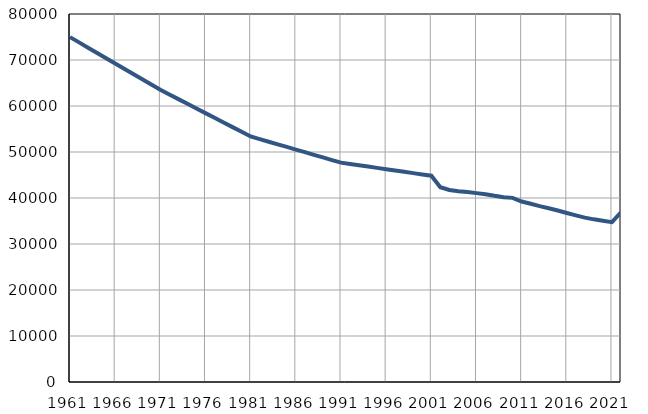
| Category | Population
size |
|---|---|
| 1961.0 | 74971 |
| 1962.0 | 73827 |
| 1963.0 | 72683 |
| 1964.0 | 71539 |
| 1965.0 | 70395 |
| 1966.0 | 69251 |
| 1967.0 | 68107 |
| 1968.0 | 66963 |
| 1969.0 | 65819 |
| 1970.0 | 64674 |
| 1971.0 | 63531 |
| 1972.0 | 62515 |
| 1973.0 | 61500 |
| 1974.0 | 60484 |
| 1975.0 | 59468 |
| 1976.0 | 58453 |
| 1977.0 | 57437 |
| 1978.0 | 56421 |
| 1979.0 | 55405 |
| 1980.0 | 54390 |
| 1981.0 | 53374 |
| 1982.0 | 52805 |
| 1983.0 | 52236 |
| 1984.0 | 51666 |
| 1985.0 | 51097 |
| 1986.0 | 50527 |
| 1987.0 | 49959 |
| 1988.0 | 49390 |
| 1989.0 | 48820 |
| 1990.0 | 48250 |
| 1991.0 | 47682 |
| 1992.0 | 47398 |
| 1993.0 | 47114 |
| 1994.0 | 46831 |
| 1995.0 | 46547 |
| 1996.0 | 46263 |
| 1997.0 | 45979 |
| 1998.0 | 45695 |
| 1999.0 | 45411 |
| 2000.0 | 45128 |
| 2001.0 | 44844 |
| 2002.0 | 42333 |
| 2003.0 | 41743 |
| 2004.0 | 41481 |
| 2005.0 | 41318 |
| 2006.0 | 41061 |
| 2007.0 | 40819 |
| 2008.0 | 40471 |
| 2009.0 | 40169 |
| 2010.0 | 40030 |
| 2011.0 | 39226 |
| 2012.0 | 38746 |
| 2013.0 | 38226 |
| 2014.0 | 37779 |
| 2015.0 | 37275 |
| 2016.0 | 36739 |
| 2017.0 | 36222 |
| 2018.0 | 35732 |
| 2019.0 | 35359 |
| 2020.0 | 35052 |
| 2021.0 | 34749 |
| 2022.0 | 36887 |